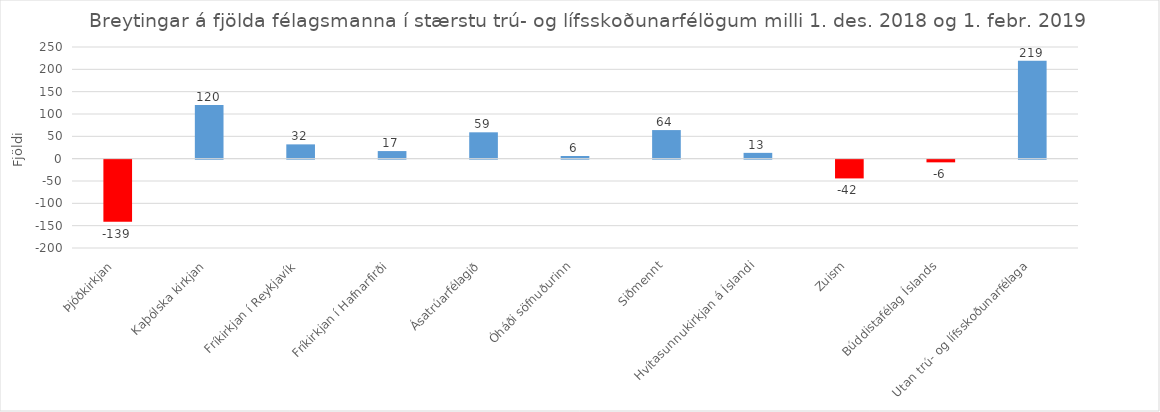
| Category | Series 0 |
|---|---|
| Þjóðkirkjan | -139 |
| Kaþólska kirkjan | 120 |
| Fríkirkjan í Reykjavík | 32 |
| Fríkirkjan í Hafnarfirði | 17 |
| Ásatrúarfélagið | 59 |
| Óháði söfnuðurinn | 6 |
| Siðmennt | 64 |
| Hvítasunnukirkjan á Íslandi | 13 |
| Zuism | -42 |
| Búddistafélag Íslands | -6 |
| Utan trú- og lífsskoðunarfélaga | 219 |